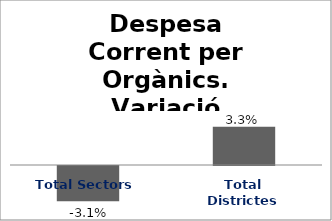
| Category | Series 0 |
|---|---|
| Total Sectors | -0.031 |
| Total Districtes | 0.033 |